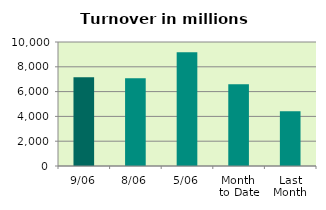
| Category | Series 0 |
|---|---|
| 9/06 | 7160.745 |
| 8/06 | 7081.172 |
| 5/06 | 9163.641 |
| Month 
to Date | 6600.448 |
| Last
Month | 4406.275 |